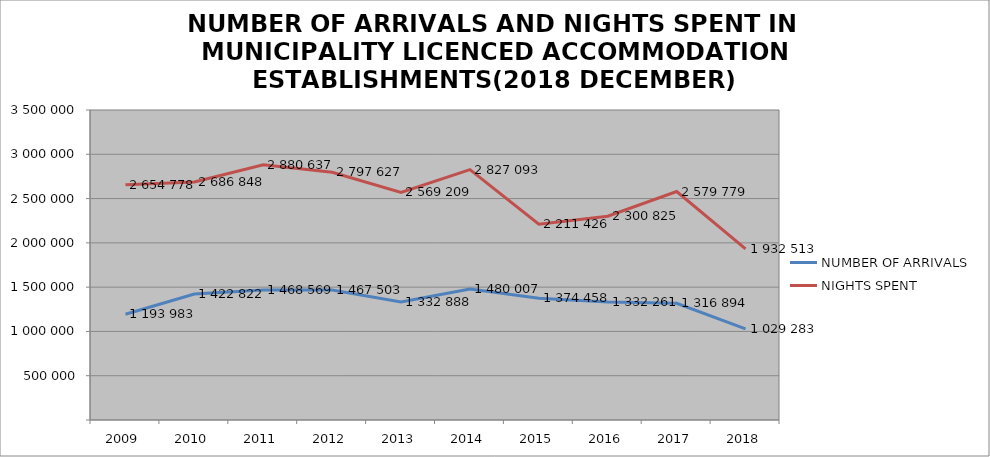
| Category | NUMBER OF ARRIVALS | NIGHTS SPENT |
|---|---|---|
| 2009 | 1193983 | 2654778 |
| 2010 | 1422822 | 2686848 |
| 2011 | 1468569 | 2880637 |
| 2012 | 1467503 | 2797627 |
| 2013 | 1332888 | 2569209 |
| 2014 | 1480007 | 2827093 |
| 2015 | 1374458 | 2211426 |
| 2016 | 1332261 | 2300825 |
| 2017 | 1316894 | 2579779 |
| 2018 | 1029283 | 1932513 |